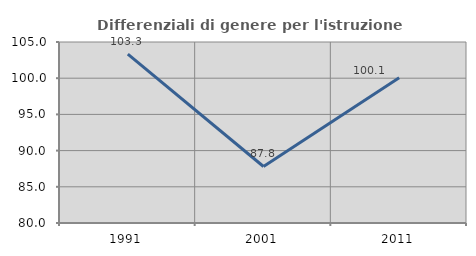
| Category | Differenziali di genere per l'istruzione superiore |
|---|---|
| 1991.0 | 103.321 |
| 2001.0 | 87.806 |
| 2011.0 | 100.052 |